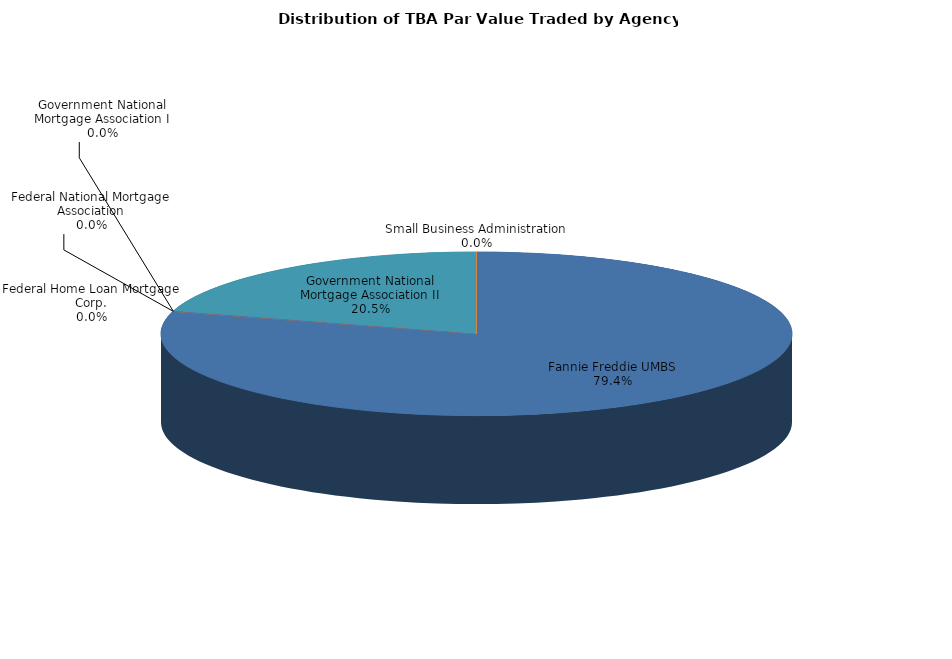
| Category | Series 0 |
|---|---|
| Fannie Freddie UMBS | 189534085619.477 |
| Federal Home Loan Mortgage Corp. | 196041.388 |
| Federal National Mortgage Association | 0 |
| Government National Mortgage Association I | 79890872.956 |
| Government National Mortgage Association II | 48971399746.235 |
| Small Business Administration | 13032894.62 |